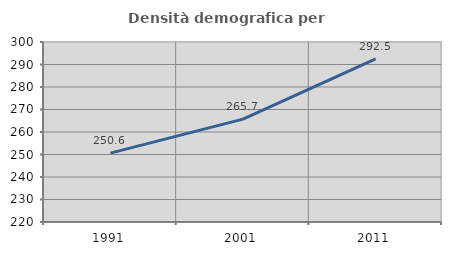
| Category | Densità demografica |
|---|---|
| 1991.0 | 250.622 |
| 2001.0 | 265.723 |
| 2011.0 | 292.469 |